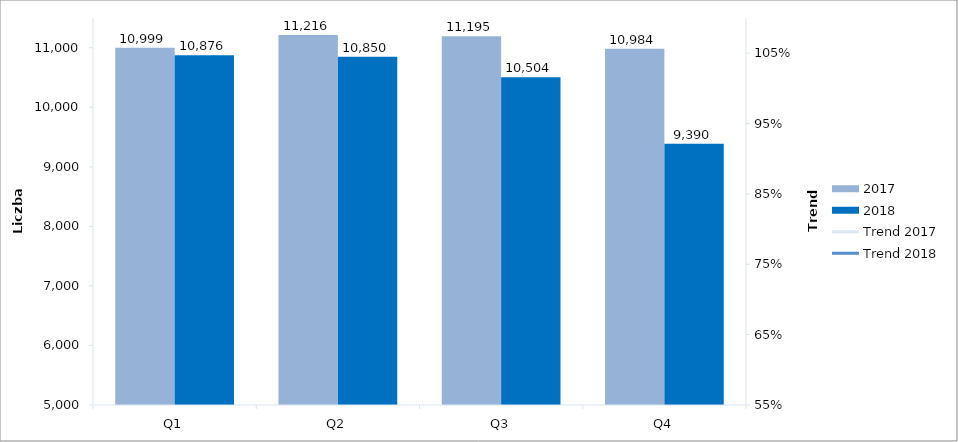
| Category | 2017 | 2018 |
|---|---|---|
| Q1 | 10999 | 10876 |
| Q2 | 11216 | 10850 |
| Q3 | 11195 | 10504 |
| Q4 | 10984 | 9390 |